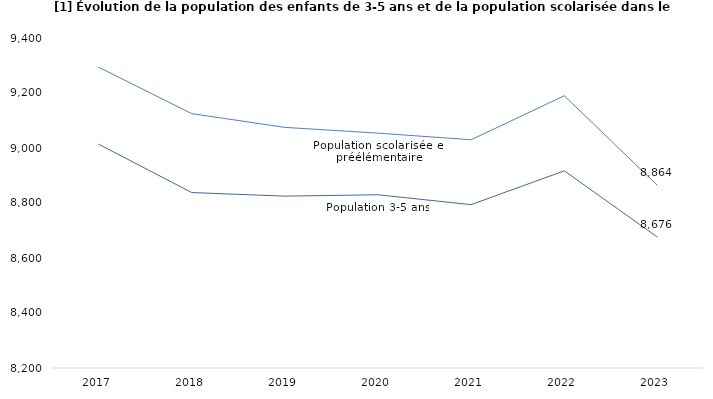
| Category | Population 3-5 ans | Population scolarisée en préélémentaire  | Series 2 |
|---|---|---|---|
| 2017 | 9014 | 9294 |  |
| 2018 | 8838 | 9125 |  |
| 2019 | 8825 | 9075 |  |
| 2020 | 8830 | 9054 |  |
| 2021 | 8794 | 9030 |  |
| 2022 | 8917 | 9190 |  |
| 2023 | 8676 | 8864 |  |